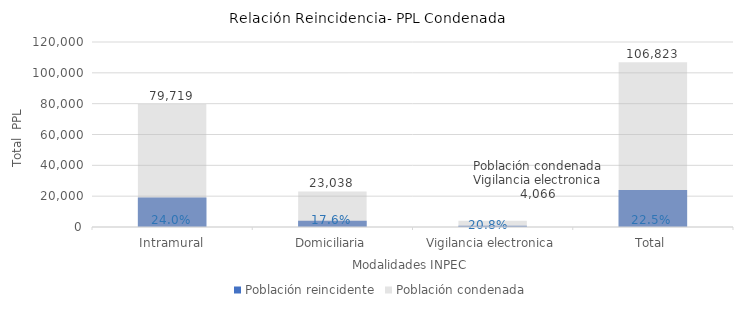
| Category | Población reincidente | Población condenada |
|---|---|---|
| Intramural | 19157 | 79719 |
| Domiciliaria | 4056 | 23038 |
| Vigilancia electronica | 846 | 4066 |
| Total | 24059 | 106823 |